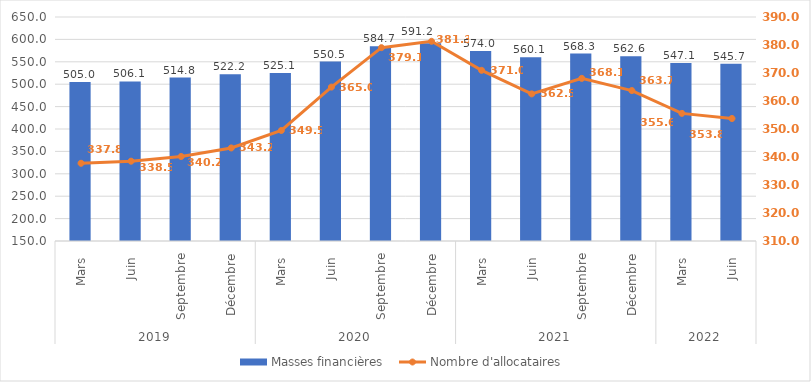
| Category | Masses financières  |
|---|---|
| 0 | 504.972 |
| 1 | 506.134 |
| 2 | 514.759 |
| 3 | 522.168 |
| 4 | 525.113 |
| 5 | 550.484 |
| 6 | 584.676 |
| 7 | 591.226 |
| 8 | 574.035 |
| 9 | 560.134 |
| 10 | 568.254 |
| 11 | 562.624 |
| 12 | 547.097 |
| 13 | 545.722 |